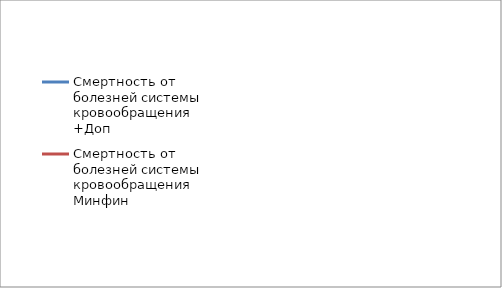
| Category | Смертность от болезней системы кровообращения +Доп | Смертность от болезней системы кровообращения Минфин |
|---|---|---|
| 2011.0 | 753 | 753 |
| 2012.0 | 727.362 | 727.362 |
| 2013.0 | 702.598 | 702.598 |
| 2014.0 | 678.676 | 678.676 |
| 2015.0 | 655.569 | 655.569 |
| 2016.0 | 633.249 | 649 |
| 2017.0 | 611.689 | 643 |
| 2018.0 | 590.862 | 638 |
| 2019.0 | 570.8 | 630 |
| 2020.0 | 551.4 | 626 |